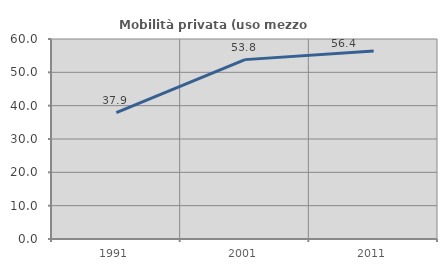
| Category | Mobilità privata (uso mezzo privato) |
|---|---|
| 1991.0 | 37.897 |
| 2001.0 | 53.812 |
| 2011.0 | 56.419 |